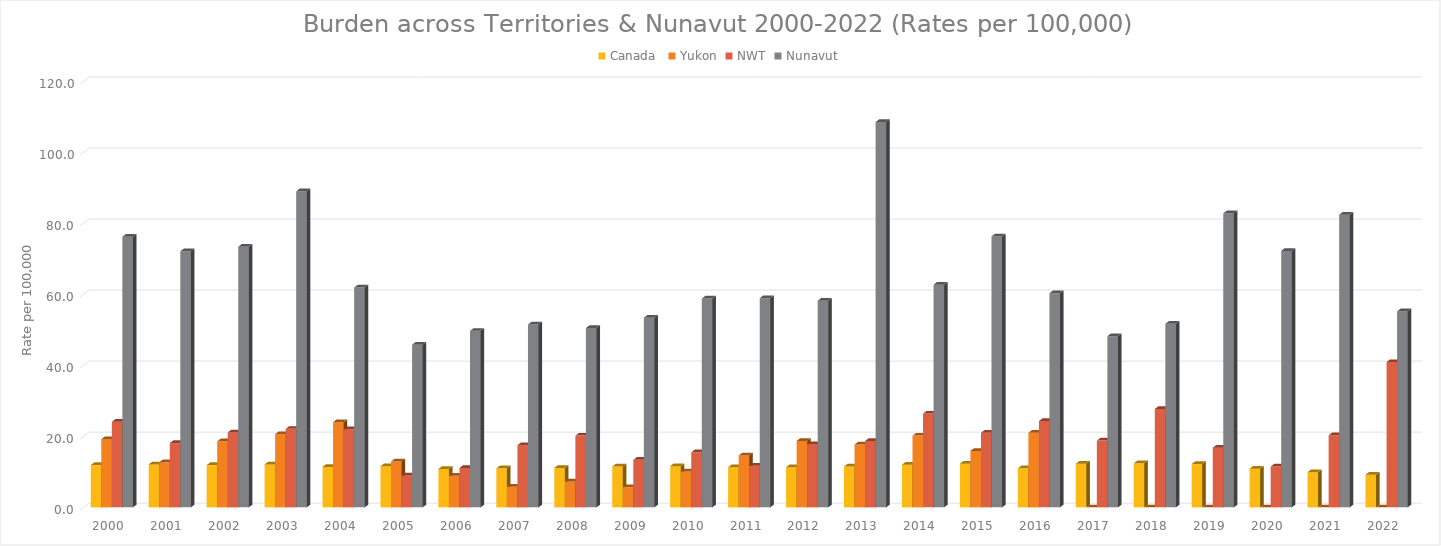
| Category | Canada  | Yukon | NWT | Nunavut |
|---|---|---|---|---|
| 2000.0 | 11.9 | 19.2 | 24.1 | 76.2 |
| 2001.0 | 12.1 | 12.7 | 18.1 | 72.1 |
| 2002.0 | 11.9 | 18.6 | 21.1 | 73.4 |
| 2003.0 | 12.1 | 20.6 | 22.1 | 89 |
| 2004.0 | 11.4 | 24 | 22 | 61.9 |
| 2005.0 | 11.6 | 12.9 | 9 | 45.8 |
| 2006.0 | 10.8 | 8.9 | 11.1 | 49.7 |
| 2007.0 | 11 | 5.8 | 17.5 | 51.5 |
| 2008.0 | 11.1 | 7.3 | 20.2 | 50.5 |
| 2009.0 | 11.5 | 5.7 | 13.4 | 53.4 |
| 2010.0 | 11.6 | 10.1 | 15.5 | 58.8 |
| 2011.0 | 11.3 | 14.6 | 11.7 | 58.9 |
| 2012.0 | 11.3 | 18.7 | 17.8 | 58.2 |
| 2013.0 | 11.5 | 17.7 | 18.7 | 108.5 |
| 2014.0 | 12 | 20.2 | 26.4 | 62.7 |
| 2015.0 | 12.3 | 15.9 | 21 | 76.3 |
| 2016.0 | 11 | 21 | 24.3 | 60.3 |
| 2017.0 | 12.3 | 0 | 18.8 | 48.2 |
| 2018.0 | 12.4 | 0 | 27.7 | 51.7 |
| 2019.0 | 12.2 | 0 | 16.8 | 82.8 |
| 2020.0 | 10.9 | 0 | 11.5 | 72.2 |
| 2021.0 | 9.9 | 0 | 20.3 | 82.4 |
| 2022.0 | 9.2 | 0 | 40.9 | 55.2 |